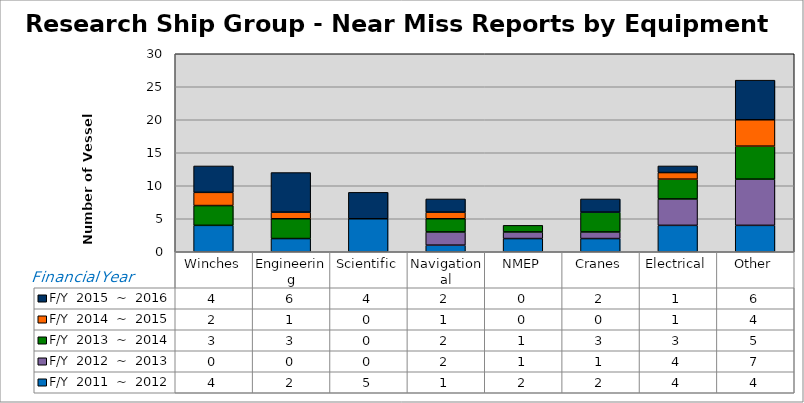
| Category | F/Y  2011  ~  2012 | F/Y  2012  ~  2013 | F/Y  2013  ~  2014 | F/Y  2014  ~  2015 | F/Y  2015  ~  2016 |
|---|---|---|---|---|---|
| Winches | 4 | 0 | 3 | 2 | 4 |
| Engineering | 2 | 0 | 3 | 1 | 6 |
| Scientific | 5 | 0 | 0 | 0 | 4 |
| Navigational | 1 | 2 | 2 | 1 | 2 |
| NMEP | 2 | 1 | 1 | 0 | 0 |
| Cranes | 2 | 1 | 3 | 0 | 2 |
| Electrical | 4 | 4 | 3 | 1 | 1 |
| Other | 4 | 7 | 5 | 4 | 6 |